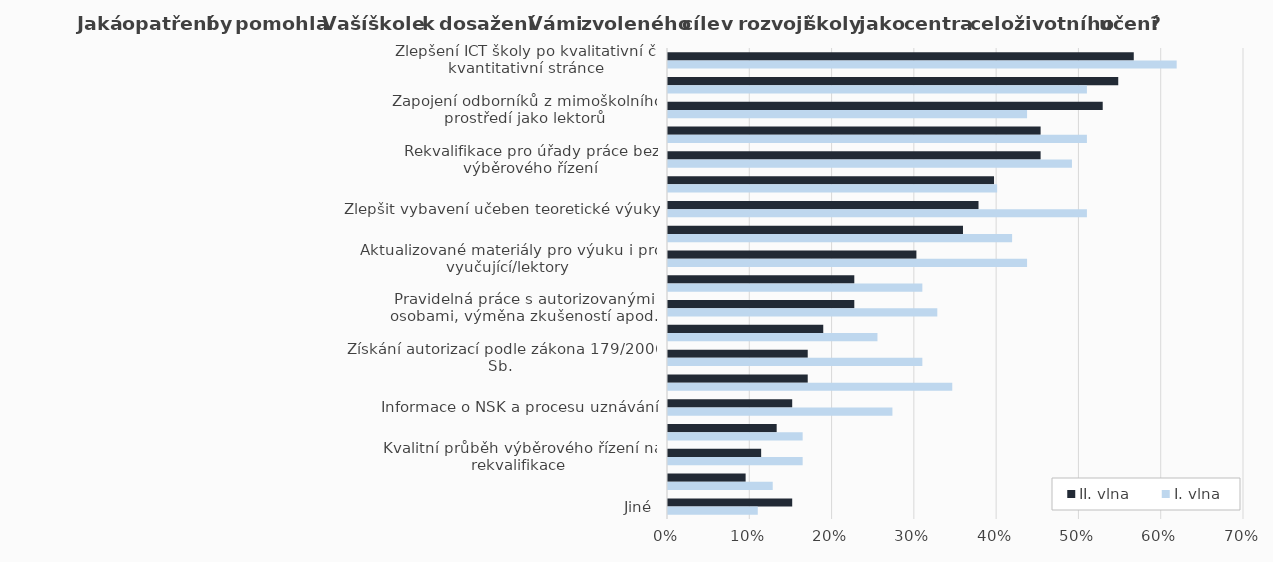
| Category | II. vlna | I. vlna |
|---|---|---|
| Zlepšení ICT školy po kvalitativní či kvantitativní stránce | 0.566 | 0.618 |
| Finance na kvalitní materiál | 0.547 | 0.509 |
| Zapojení odborníků z mimoškolního prostředí jako lektorů | 0.528 | 0.436 |
| Příprava pedagogických pracovníků jako lektorů dalšího vzdělávání | 0.453 | 0.509 |
| Rekvalifikace pro úřady práce bez výběrového řízení | 0.453 | 0.491 |
| Stáže lektorů/pracovníků školy ve firmách | 0.396 | 0.4 |
| Zlepšit vybavení učeben teoretické výuky | 0.377 | 0.509 |
| Zlepšit vybavení dílen pro odborný výcvik | 0.358 | 0.418 |
| Aktualizované materiály pro výuku i pro vyučující/lektory | 0.302 | 0.436 |
| Více učeben | 0.226 | 0.309 |
| Pravidelná práce s autorizovanými osobami, výměna zkušeností apod.  | 0.226 | 0.327 |
| Další vzdělávání pedagog. prac. ve vybraných technologiích, obsluze vybraných strojů apod.  | 0.189 | 0.255 |
| Získání autorizací podle zákona 179/2006 Sb. | 0.17 | 0.309 |
| Proškolení pracovníka školy v problematice výběrových řízení, vedení dokumentace apod. | 0.17 | 0.345 |
| Informace o NSK a procesu uznávání | 0.151 | 0.273 |
| Podpora při vytváření konkrétních zadání pro zkoušku | 0.132 | 0.164 |
| Kvalitní průběh výběrového řízení na rekvalifikace | 0.113 | 0.164 |
| Využívání vstupní diagnostiky profesních kompetencí účastníků rekvalifikací | 0.094 | 0.127 |
| Jiné | 0.151 | 0.109 |